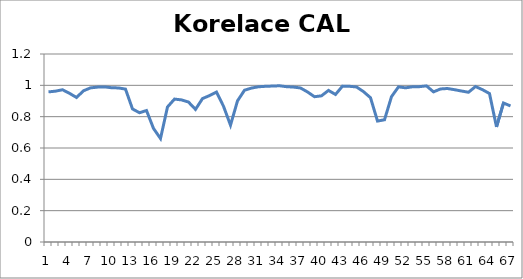
| Category | Korelace CAL 14 |
|---|---|
| 0 | 0.958 |
| 1 | 0.963 |
| 2 | 0.972 |
| 3 | 0.949 |
| 4 | 0.922 |
| 5 | 0.965 |
| 6 | 0.984 |
| 7 | 0.989 |
| 8 | 0.99 |
| 9 | 0.985 |
| 10 | 0.983 |
| 11 | 0.976 |
| 12 | 0.849 |
| 13 | 0.825 |
| 14 | 0.839 |
| 15 | 0.725 |
| 16 | 0.66 |
| 17 | 0.862 |
| 18 | 0.912 |
| 19 | 0.907 |
| 20 | 0.893 |
| 21 | 0.846 |
| 22 | 0.915 |
| 23 | 0.935 |
| 24 | 0.957 |
| 25 | 0.866 |
| 26 | 0.746 |
| 27 | 0.901 |
| 28 | 0.969 |
| 29 | 0.983 |
| 30 | 0.991 |
| 31 | 0.994 |
| 32 | 0.995 |
| 33 | 0.997 |
| 34 | 0.991 |
| 35 | 0.989 |
| 36 | 0.983 |
| 37 | 0.958 |
| 38 | 0.927 |
| 39 | 0.933 |
| 40 | 0.968 |
| 41 | 0.942 |
| 42 | 0.995 |
| 43 | 0.994 |
| 44 | 0.99 |
| 45 | 0.96 |
| 46 | 0.921 |
| 47 | 0.772 |
| 48 | 0.78 |
| 49 | 0.928 |
| 50 | 0.99 |
| 51 | 0.984 |
| 52 | 0.991 |
| 53 | 0.992 |
| 54 | 0.996 |
| 55 | 0.958 |
| 56 | 0.977 |
| 57 | 0.98 |
| 58 | 0.972 |
| 59 | 0.964 |
| 60 | 0.956 |
| 61 | 0.992 |
| 62 | 0.972 |
| 63 | 0.947 |
| 64 | 0.734 |
| 65 | 0.887 |
| 66 | 0.868 |